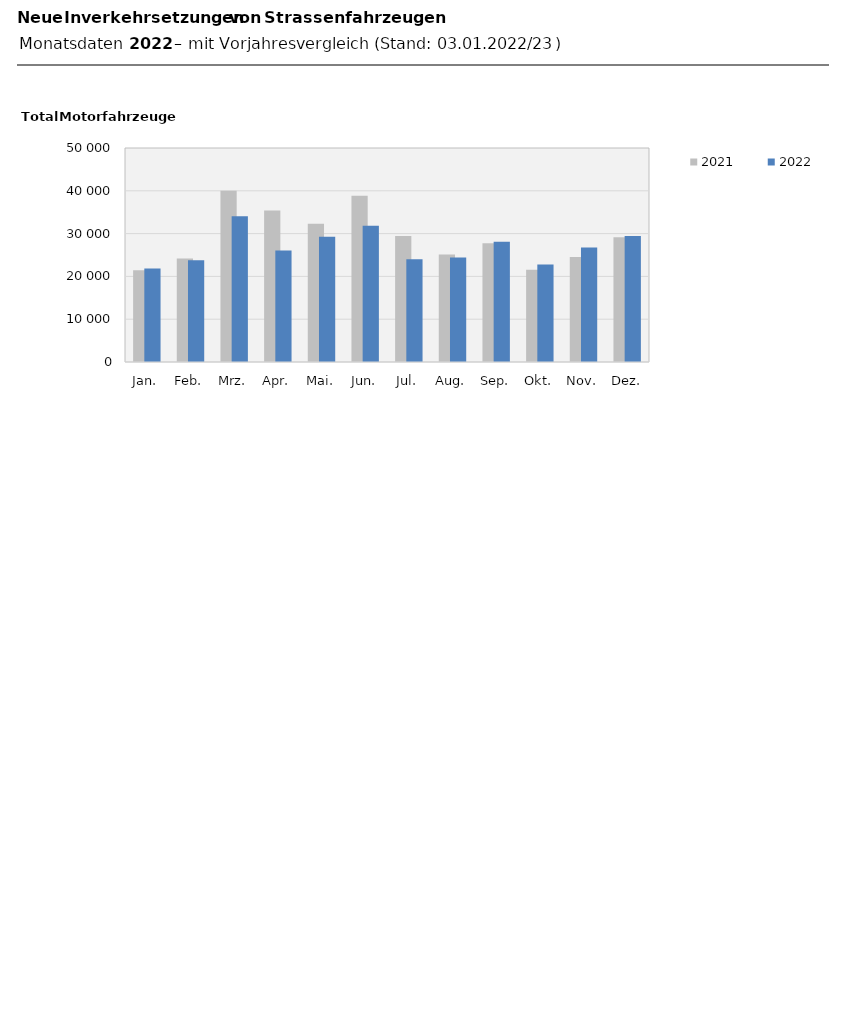
| Category | 2021 | 2022 |
|---|---|---|
| Jan. | 21417 | 21866 |
| Feb. | 24177 | 23784 |
| Mrz. | 40000 | 34075 |
| Apr. | 35400 | 26079 |
| Mai. | 32326 | 29254 |
| Jun. | 38853 | 31810 |
| Jul. | 29414 | 23983 |
| Aug. | 25107 | 24433 |
| Sep. | 27750 | 28123 |
| Okt. | 21528 | 22806 |
| Nov. | 24537 | 26724 |
| Dez. | 29156 | 29450 |